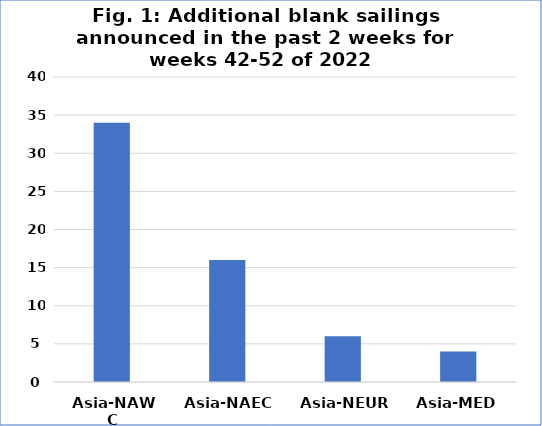
| Category | Series 0 |
|---|---|
| Asia-NAWC | 34 |
| Asia-NAEC | 16 |
| Asia-NEUR | 6 |
| Asia-MED | 4 |